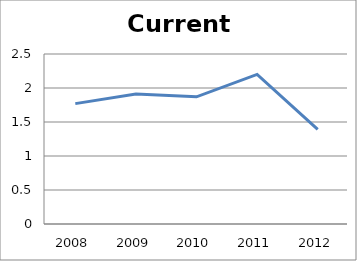
| Category | Series 0 |
|---|---|
| 2008.0 | 1.77 |
| 2009.0 | 1.91 |
| 2010.0 | 1.87 |
| 2011.0 | 2.2 |
| 2012.0 | 1.39 |